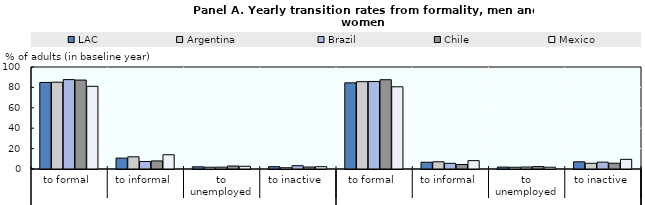
| Category | LAC | Argentina  | Brazil | Chile | Mexico  |
|---|---|---|---|---|---|
| 0 | 84.884 | 85.092 | 87.639 | 87.19 | 81.079 |
| 1 | 10.668 | 11.936 | 7.334 | 7.916 | 13.982 |
| 2 | 2.151 | 1.742 | 1.798 | 2.946 | 2.662 |
| 3 | 2.296 | 1.23 | 3.229 | 1.948 | 2.277 |
| 4 | 84.447 | 85.617 | 85.784 | 87.543 | 80.599 |
| 5 | 6.63 | 7.068 | 5.552 | 4.414 | 8.189 |
| 6 | 1.871 | 1.705 | 1.941 | 2.373 | 1.745 |
| 7 | 7.051 | 5.61 | 6.722 | 5.669 | 9.468 |